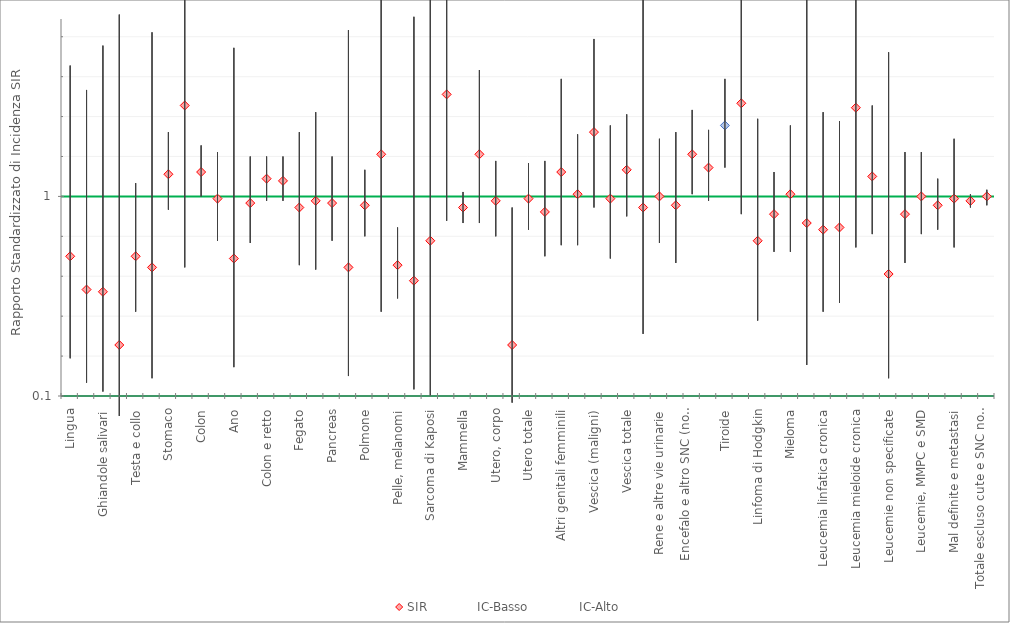
| Category | SIR | IC-Basso | IC-Alto |
|---|---|---|---|
| Lingua | 0.73 | 0.27 | 1.59 |
| Bocca | 0.58 | 0.16 | 1.48 |
| Ghiandole salivari | 0.57 | 0.12 | 1.68 |
| Orofaringe | 0.33 | 0.01 | 1.82 |
| Testa e collo | 0.73 | 0.48 | 1.06 |
| Esofago | 0.68 | 0.18 | 1.74 |
| Stomaco | 1.1 | 0.94 | 1.29 |
| Intestino tenue | 1.41 | 0.68 | 2.59 |
| Colon | 1.11 | 1 | 1.23 |
| Retto | 0.99 | 0.8 | 1.2 |
| Ano | 0.72 | 0.23 | 1.67 |
| Retto e ano | 0.97 | 0.79 | 1.18 |
| Colon e retto | 1.08 | 0.98 | 1.18 |
| Colon, retto e ano | 1.07 | 0.98 | 1.18 |
| Fegato | 0.95 | 0.69 | 1.29 |
| Vie biliari | 0.98 | 0.67 | 1.38 |
| Pancreas | 0.97 | 0.8 | 1.18 |
| Laringe | 0.68 | 0.19 | 1.75 |
| Polmone | 0.96 | 0.82 | 1.12 |
| Altri organi toracici | 1.19 | 0.48 | 2.46 |
| Pelle, melanomi | 0.69 | 0.54 | 0.86 |
| Mesotelioma | 0.62 | 0.13 | 1.81 |
| Sarcoma di Kaposi | 0.8 | 0.1 | 2.87 |
| Tessuti molli | 1.46 | 0.89 | 2.25 |
| Mammella | 0.95 | 0.88 | 1.02 |
| Utero, collo | 1.19 | 0.88 | 1.57 |
| Utero, corpo | 0.98 | 0.82 | 1.16 |
| Utero non specificato | 0.33 | 0.07 | 0.95 |
| Utero totale | 0.99 | 0.85 | 1.15 |
| Ovaio | 0.93 | 0.73 | 1.16 |
| Altri genitali femminili | 1.11 | 0.78 | 1.53 |
| Rene | 1.01 | 0.78 | 1.28 |
| Vescica (maligni) | 1.29 | 0.95 | 1.71 |
| Vescica (non maligni) | 0.99 | 0.72 | 1.32 |
| Vescica totale | 1.12 | 0.91 | 1.37 |
| Altre vie urinarie | 0.95 | 0.38 | 1.95 |
| Rene e altre vie urinarie | 1 | 0.79 | 1.26 |
| Encefalo e altro SNC (maligni) | 0.96 | 0.7 | 1.29 |
| Encefalo e altro SNC (non maligni) | 1.19 | 1.01 | 1.39 |
| Encefalo e altro SNC totale | 1.13 | 0.98 | 1.3 |
| Tiroide | 1.32 | 1.13 | 1.53 |
| Altre ghiandole endocrine | 1.42 | 0.92 | 2.09 |
| Linfoma di Hodgkin | 0.8 | 0.44 | 1.35 |
| Linfoma non Hodgkin | 0.92 | 0.75 | 1.11 |
| Mieloma | 1.01 | 0.75 | 1.32 |
| Leucemia linfatica acuta | 0.88 | 0.24 | 2.25 |
| Leucemia linfatica cronica | 0.85 | 0.48 | 1.38 |
| Leucemia mieloide acuta | 0.86 | 0.52 | 1.34 |
| Leucemia mieloide cronica | 1.4 | 0.77 | 2.35 |
| Altre MMPC e SMD | 1.09 | 0.83 | 1.41 |
| Leucemie non specificate | 0.65 | 0.18 | 1.65 |
| Leucemie totali | 0.92 | 0.7 | 1.2 |
| Leucemie, MMPC e SMD | 1 | 0.83 | 1.2 |
| Neoplasie ematologiche | 0.96 | 0.85 | 1.08 |
| Mal definite e metastasi | 0.99 | 0.77 | 1.26 |
| Totale | 0.98 | 0.95 | 1.01 |
| Totale escluso cute e SNC non maligno | 1 | 0.96 | 1.03 |